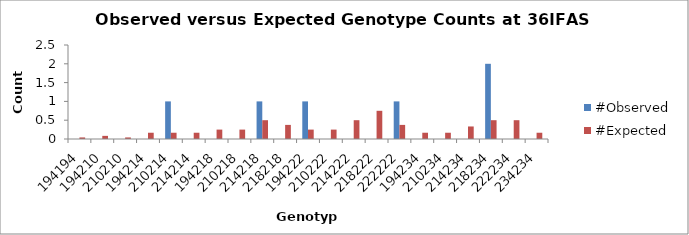
| Category | #Observed | #Expected |
|---|---|---|
| 194194.0 | 0 | 0.042 |
| 194210.0 | 0 | 0.083 |
| 210210.0 | 0 | 0.042 |
| 194214.0 | 0 | 0.167 |
| 210214.0 | 1 | 0.167 |
| 214214.0 | 0 | 0.167 |
| 194218.0 | 0 | 0.25 |
| 210218.0 | 0 | 0.25 |
| 214218.0 | 1 | 0.5 |
| 218218.0 | 0 | 0.375 |
| 194222.0 | 1 | 0.25 |
| 210222.0 | 0 | 0.25 |
| 214222.0 | 0 | 0.5 |
| 218222.0 | 0 | 0.75 |
| 222222.0 | 1 | 0.375 |
| 194234.0 | 0 | 0.167 |
| 210234.0 | 0 | 0.167 |
| 214234.0 | 0 | 0.333 |
| 218234.0 | 2 | 0.5 |
| 222234.0 | 0 | 0.5 |
| 234234.0 | 0 | 0.167 |